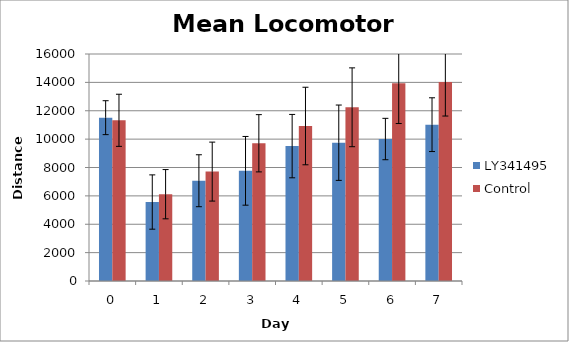
| Category | LY341495 | Control |
|---|---|---|
| 0.0 | 11512.38 | 11326.713 |
| 1.0 | 5566.226 | 6118.408 |
| 2.0 | 7067.172 | 7710.599 |
| 3.0 | 7765.89 | 9708.4 |
| 4.0 | 9507.578 | 10923.988 |
| 5.0 | 9747.348 | 12243.916 |
| 6.0 | 10007 | 13945.981 |
| 7.0 | 11018.323 | 14023.45 |